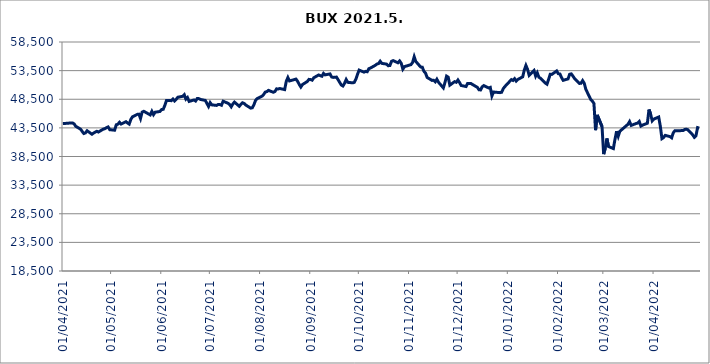
| Category | BUX |
|---|---|
| 01/04/2021 | 44242.93 |
| 06/04/2021 | 44357.86 |
| 07/04/2021 | 44357.64 |
| 08/04/2021 | 44194.16 |
| 09/04/2021 | 43775.41 |
| 12/04/2021 | 43267.25 |
| 13/04/2021 | 42865.63 |
| 14/04/2021 | 42514.94 |
| 15/04/2021 | 42626.71 |
| 16/04/2021 | 42997.61 |
| 19/04/2021 | 42388.09 |
| 20/04/2021 | 42597.26 |
| 21/04/2021 | 42753.6 |
| 22/04/2021 | 42906.48 |
| 23/04/2021 | 42772.95 |
| 26/04/2021 | 43281.61 |
| 27/04/2021 | 43357.19 |
| 28/04/2021 | 43549.43 |
| 29/04/2021 | 43665.42 |
| 30/04/2021 | 43183.2 |
| 03/05/2021 | 43093.89 |
| 04/05/2021 | 44036.18 |
| 05/05/2021 | 44142.7 |
| 06/05/2021 | 44472.71 |
| 07/05/2021 | 44164.37 |
| 10/05/2021 | 44587.59 |
| 11/05/2021 | 44350.67 |
| 12/05/2021 | 44160.71 |
| 13/05/2021 | 44974.08 |
| 14/05/2021 | 45429.12 |
| 17/05/2021 | 45862.01 |
| 18/05/2021 | 45891.45 |
| 19/05/2021 | 45128.56 |
| 20/05/2021 | 46261.37 |
| 21/05/2021 | 46396.87 |
| 25/05/2021 | 45765.15 |
| 26/05/2021 | 46379.32 |
| 27/05/2021 | 45802.61 |
| 28/05/2021 | 46233.29 |
| 31/05/2021 | 46371.02 |
| 01/06/2021 | 46699.74 |
| 02/06/2021 | 46736.89 |
| 03/06/2021 | 47422.77 |
| 04/06/2021 | 48282.14 |
| 07/06/2021 | 48255.9 |
| 08/06/2021 | 48546.45 |
| 09/06/2021 | 48206.56 |
| 10/06/2021 | 48475.07 |
| 11/06/2021 | 48845.84 |
| 14/06/2021 | 49015.24 |
| 15/06/2021 | 49299.48 |
| 16/06/2021 | 48525.74 |
| 17/06/2021 | 48795.68 |
| 18/06/2021 | 48117.72 |
| 21/06/2021 | 48379.62 |
| 22/06/2021 | 48193.16 |
| 23/06/2021 | 48624.32 |
| 24/06/2021 | 48610.4 |
| 25/06/2021 | 48461.47 |
| 28/06/2021 | 48301.62 |
| 29/06/2021 | 47759.62 |
| 30/06/2021 | 47238.09 |
| 01/07/2021 | 47908.81 |
| 02/07/2021 | 47520.42 |
| 05/07/2021 | 47423.61 |
| 06/07/2021 | 47592.47 |
| 07/07/2021 | 47574.37 |
| 08/07/2021 | 47452.73 |
| 09/07/2021 | 48157.57 |
| 12/07/2021 | 47804.26 |
| 13/07/2021 | 47592.34 |
| 14/07/2021 | 47184.6 |
| 15/07/2021 | 47677.82 |
| 16/07/2021 | 48003.25 |
| 19/07/2021 | 47268.49 |
| 20/07/2021 | 47622.68 |
| 21/07/2021 | 47882.56 |
| 22/07/2021 | 47756.88 |
| 23/07/2021 | 47491.69 |
| 26/07/2021 | 46952.76 |
| 27/07/2021 | 47002.77 |
| 28/07/2021 | 47527.53 |
| 29/07/2021 | 48286.06 |
| 30/07/2021 | 48610.95 |
| 02/08/2021 | 49041.18 |
| 03/08/2021 | 49315.61 |
| 04/08/2021 | 49745.57 |
| 05/08/2021 | 49830.28 |
| 06/08/2021 | 50050.88 |
| 09/08/2021 | 49721.84 |
| 10/08/2021 | 49849.71 |
| 11/08/2021 | 50317.1 |
| 12/08/2021 | 50289.64 |
| 13/08/2021 | 50378.65 |
| 16/08/2021 | 50183.56 |
| 17/08/2021 | 51626.62 |
| 18/08/2021 | 52288.87 |
| 19/08/2021 | 51696.55 |
| 23/08/2021 | 52023.19 |
| 24/08/2021 | 51633.85 |
| 25/08/2021 | 51093.8 |
| 26/08/2021 | 50640.51 |
| 27/08/2021 | 51068.8 |
| 30/08/2021 | 51602.58 |
| 31/08/2021 | 51969.67 |
| 01/09/2021 | 51946.96 |
| 02/09/2021 | 51830.24 |
| 03/09/2021 | 52255.11 |
| 06/09/2021 | 52743.09 |
| 07/09/2021 | 52623.96 |
| 08/09/2021 | 52514.94 |
| 09/09/2021 | 53015.67 |
| 10/09/2021 | 52755.68 |
| 13/09/2021 | 52922.72 |
| 14/09/2021 | 52392.39 |
| 15/09/2021 | 52317.91 |
| 16/09/2021 | 52331.31 |
| 17/09/2021 | 52376.91 |
| 20/09/2021 | 50982.15 |
| 21/09/2021 | 50815.56 |
| 22/09/2021 | 51298.14 |
| 23/09/2021 | 51946.86 |
| 24/09/2021 | 51453.71 |
| 27/09/2021 | 51365.99 |
| 28/09/2021 | 51446.2 |
| 29/09/2021 | 52004.6 |
| 30/09/2021 | 52854.65 |
| 01/10/2021 | 53589.8 |
| 04/10/2021 | 53234.94 |
| 05/10/2021 | 53369.78 |
| 06/10/2021 | 53305.16 |
| 07/10/2021 | 53844.59 |
| 08/10/2021 | 53955.85 |
| 11/10/2021 | 54432.56 |
| 12/10/2021 | 54648.43 |
| 13/10/2021 | 54733.73 |
| 14/10/2021 | 55136 |
| 15/10/2021 | 54764.34 |
| 18/10/2021 | 54637.92 |
| 19/10/2021 | 54356.89 |
| 20/10/2021 | 54393.63 |
| 21/10/2021 | 55121.35 |
| 22/10/2021 | 55254.39 |
| 25/10/2021 | 54867.62 |
| 26/10/2021 | 55191.91 |
| 27/10/2021 | 54780.65 |
| 28/10/2021 | 53766.44 |
| 29/10/2021 | 54197.71 |
| 02/11/2021 | 54548.9 |
| 03/11/2021 | 54914.54 |
| 04/11/2021 | 55925.58 |
| 05/11/2021 | 55099.88 |
| 08/11/2021 | 54132.14 |
| 09/11/2021 | 54099.27 |
| 10/11/2021 | 53389.23 |
| 11/11/2021 | 53073.34 |
| 12/11/2021 | 52306.67 |
| 15/11/2021 | 51789.8 |
| 16/11/2021 | 51818.41 |
| 17/11/2021 | 51549.36 |
| 18/11/2021 | 51992.3 |
| 19/11/2021 | 51472.91 |
| 22/11/2021 | 50483.99 |
| 23/11/2021 | 51424.26 |
| 24/11/2021 | 52535.97 |
| 25/11/2021 | 52364.37 |
| 26/11/2021 | 50961.25 |
| 29/11/2021 | 51579.66 |
| 30/11/2021 | 51464.6 |
| 01/12/2021 | 51860.19 |
| 02/12/2021 | 51420.71 |
| 03/12/2021 | 50904.91 |
| 06/12/2021 | 50723.42 |
| 07/12/2021 | 51268.65 |
| 08/12/2021 | 51261.63 |
| 09/12/2021 | 51262.82 |
| 10/12/2021 | 51076.61 |
| 13/12/2021 | 50581.29 |
| 14/12/2021 | 50153 |
| 15/12/2021 | 50131.61 |
| 16/12/2021 | 50672.47 |
| 17/12/2021 | 50887.3 |
| 20/12/2021 | 50471.14 |
| 21/12/2021 | 50571.05 |
| 22/12/2021 | 49083.56 |
| 23/12/2021 | 49762.24 |
| 27/12/2021 | 49654.12 |
| 28/12/2021 | 49718.15 |
| 29/12/2021 | 50342.57 |
| 30/12/2021 | 50720.71 |
| 03/01/2022 | 51924.62 |
| 04/01/2022 | 51785.29 |
| 05/01/2022 | 52097.34 |
| 06/01/2022 | 51668.96 |
| 07/01/2022 | 51956.74 |
| 10/01/2022 | 52416.01 |
| 11/01/2022 | 53599.36 |
| 12/01/2022 | 54405.84 |
| 13/01/2022 | 53736.16 |
| 14/01/2022 | 52675.9 |
| 17/01/2022 | 53509.01 |
| 18/01/2022 | 52545.64 |
| 19/01/2022 | 53121.9 |
| 20/01/2022 | 52349.65 |
| 21/01/2022 | 52169.8 |
| 24/01/2022 | 51325.34 |
| 25/01/2022 | 51134.63 |
| 26/01/2022 | 51958.75 |
| 27/01/2022 | 52866.56 |
| 28/01/2022 | 52838.78 |
| 31/01/2022 | 53442.24 |
| 01/02/2022 | 52959.27 |
| 02/02/2022 | 52910.14 |
| 03/02/2022 | 52284.64 |
| 04/02/2022 | 51806.4 |
| 07/02/2022 | 52054.67 |
| 08/02/2022 | 52861.48 |
| 09/02/2022 | 52930.3 |
| 10/02/2022 | 52566.76 |
| 11/02/2022 | 52141.58 |
| 14/02/2022 | 51262 |
| 15/02/2022 | 51295.36 |
| 16/02/2022 | 51756.19 |
| 17/02/2022 | 51305.38 |
| 18/02/2022 | 50237.2 |
| 21/02/2022 | 48470.72 |
| 22/02/2022 | 48177.46 |
| 23/02/2022 | 47762.14 |
| 24/02/2022 | 43102.34 |
| 25/02/2022 | 45769.16 |
| 28/02/2022 | 43731.25 |
| 01/03/2022 | 38913.62 |
| 02/03/2022 | 39976.11 |
| 03/03/2022 | 41651.26 |
| 04/03/2022 | 40246.7 |
| 07/03/2022 | 39883.29 |
| 08/03/2022 | 41515.5 |
| 09/03/2022 | 42909.74 |
| 10/03/2022 | 42028.33 |
| 11/03/2022 | 42905.55 |
| 16/03/2022 | 44126.44 |
| 17/03/2022 | 44596.58 |
| 18/03/2022 | 43935.56 |
| 21/03/2022 | 44256.7 |
| 22/03/2022 | 44338.45 |
| 23/03/2022 | 44612.73 |
| 24/03/2022 | 43817.63 |
| 25/03/2022 | 43983.38 |
| 28/03/2022 | 44310.12 |
| 29/03/2022 | 46707.52 |
| 30/03/2022 | 45890.18 |
| 31/03/2022 | 44726.28 |
| 01/04/2022 | 45034.79 |
| 04/04/2022 | 45397.52 |
| 05/04/2022 | 43787 |
| 06/04/2022 | 41616.26 |
| 07/04/2022 | 41807.97 |
| 08/04/2022 | 42191.13 |
| 11/04/2022 | 41972.84 |
| 12/04/2022 | 41766.96 |
| 13/04/2022 | 42651.63 |
| 14/04/2022 | 42999.39 |
| 19/04/2022 | 43026.8 |
| 20/04/2022 | 43208.44 |
| 21/04/2022 | 43265.66 |
| 22/04/2022 | 43176.64 |
| 25/04/2022 | 42280.37 |
| 26/04/2022 | 41848.66 |
| 27/04/2022 | 42116.04 |
| 28/04/2022 | 43549.19 |
| 29/04/2022 | 43469.84 |